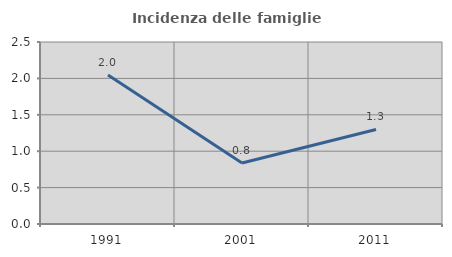
| Category | Incidenza delle famiglie numerose |
|---|---|
| 1991.0 | 2.048 |
| 2001.0 | 0.838 |
| 2011.0 | 1.299 |